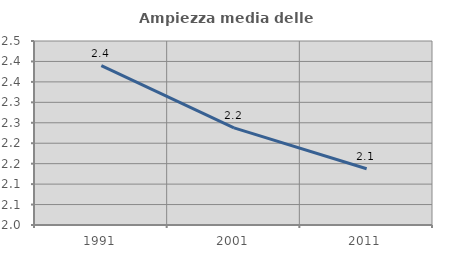
| Category | Ampiezza media delle famiglie |
|---|---|
| 1991.0 | 2.39 |
| 2001.0 | 2.238 |
| 2011.0 | 2.137 |